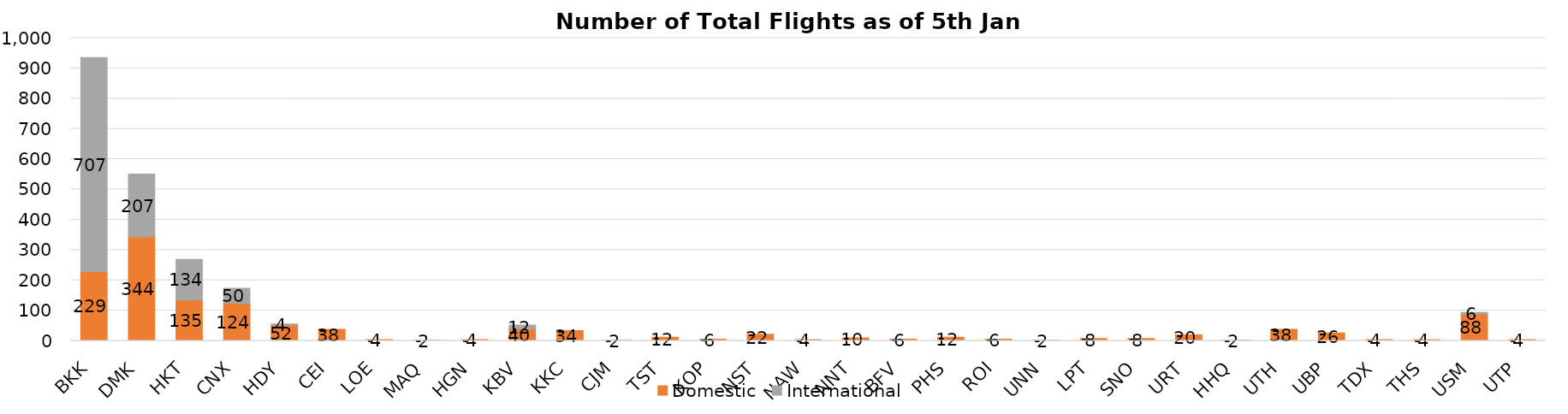
| Category | Domestic | International |
|---|---|---|
| BKK | 229 | 707 |
| DMK | 344 | 207 |
| HKT | 135 | 134 |
| CNX | 124 | 50 |
| HDY | 52 | 4 |
| CEI | 38 | 0 |
| LOE | 4 | 0 |
| MAQ | 2 | 0 |
| HGN | 4 | 0 |
| KBV | 40 | 12 |
| KKC | 34 | 0 |
| CJM | 2 | 0 |
| TST | 12 | 0 |
| KOP | 6 | 0 |
| NST | 22 | 0 |
| NAW | 4 | 0 |
| NNT | 10 | 0 |
| BFV | 6 | 0 |
| PHS | 12 | 0 |
| ROI | 6 | 0 |
| UNN | 2 | 0 |
| LPT | 8 | 0 |
| SNO | 8 | 0 |
| URT | 20 | 0 |
| HHQ | 2 | 0 |
| UTH | 38 | 0 |
| UBP | 26 | 0 |
| TDX | 4 | 0 |
| THS | 4 | 0 |
| USM | 88 | 6 |
| UTP | 4 | 0 |